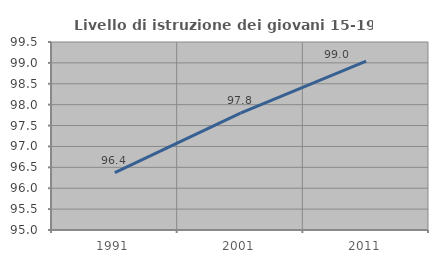
| Category | Livello di istruzione dei giovani 15-19 anni |
|---|---|
| 1991.0 | 96.375 |
| 2001.0 | 97.797 |
| 2011.0 | 99.043 |